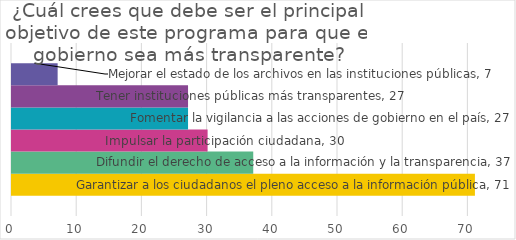
| Category | Garantizar a los ciudadanos el pleno acceso a la información pública | Difundir el derecho de acceso a la información y la transparencia | Impulsar la participación ciudadana | Fomentar la vigilancia a las acciones de gobierno en el país | Tener instituciones públicas más transparentes | Mejorar el estado de los archivos en las instituciones públicas |
|---|---|---|---|---|---|---|
| ¿Cuál crees que debe ser el principal objetivo de este programa para que el gobierno sea más transparente? | 71 | 37 | 30 | 27 | 27 | 7 |